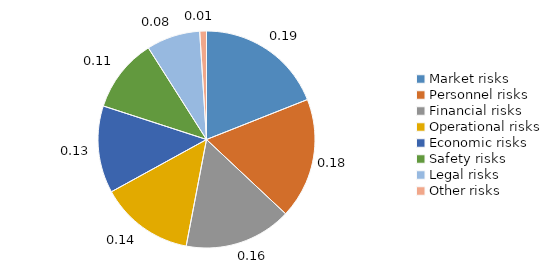
| Category | Series 0 |
|---|---|
| Market risks | 0.19 |
| Personnel risks | 0.18 |
| Financial risks | 0.16 |
| Operational risks | 0.14 |
| Economic risks | 0.13 |
| Safety risks | 0.11 |
| Legal risks | 0.08 |
| Other risks | 0.01 |